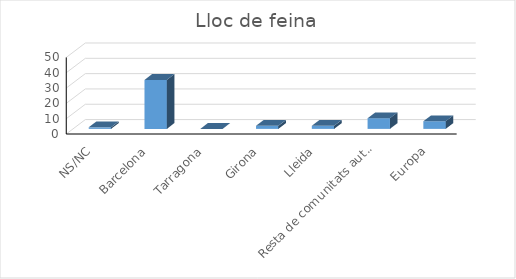
| Category | Series 0 |
|---|---|
| NS/NC | 1 |
| Barcelona | 32 |
| Tarragona | 0 |
| Girona | 2 |
| Lleida | 2 |
| Resta de comunitats autònomes | 7 |
| Europa | 5 |